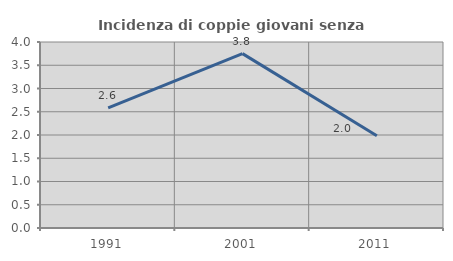
| Category | Incidenza di coppie giovani senza figli |
|---|---|
| 1991.0 | 2.584 |
| 2001.0 | 3.75 |
| 2011.0 | 1.985 |